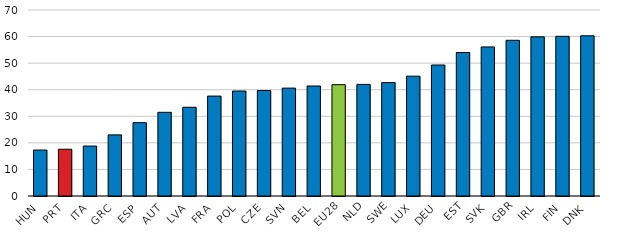
| Category | Yes |
|---|---|
| HUN | 17.3 |
| PRT | 17.6 |
| ITA | 18.8 |
| GRC | 23 |
| ESP | 27.6 |
| AUT | 31.5 |
| LVA | 33.4 |
| FRA | 37.6 |
| POL | 39.5 |
| CZE | 39.7 |
| SVN | 40.6 |
| BEL | 41.4 |
| EU28 | 41.9 |
| NLD | 42 |
| SWE | 42.7 |
| LUX | 45.1 |
| DEU | 49.3 |
| EST | 54 |
| SVK | 56.1 |
| GBR | 58.6 |
| IRL | 59.9 |
| FIN | 60.1 |
| DNK | 60.3 |